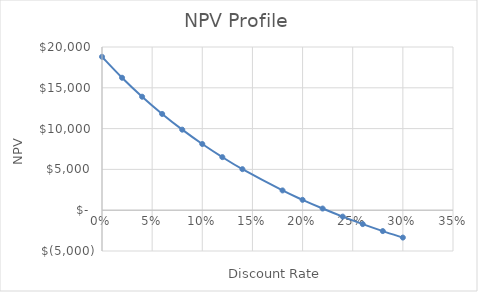
| Category | Series 0 |
|---|---|
| 0.0 | 18800 |
| 0.02 | 16232.383 |
| 0.04 | 13906.321 |
| 0.06 | 11793.37 |
| 0.08 | 9869.007 |
| 0.1 | 8112.017 |
| 0.12 | 6503.99 |
| 0.14 | 5028.899 |
| 0.18 | 2423.296 |
| 0.2 | 1269.772 |
| 0.22 | 202.71 |
| 0.24 | -786.253 |
| 0.26 | -1704.513 |
| 0.28 | -2558.634 |
| 0.3 | -3354.45 |